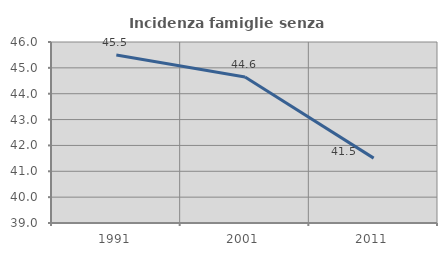
| Category | Incidenza famiglie senza nuclei |
|---|---|
| 1991.0 | 45.495 |
| 2001.0 | 44.643 |
| 2011.0 | 41.509 |